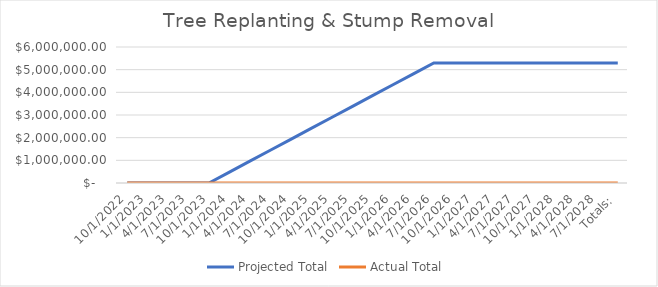
| Category | Projected Total | Actual Total  |
|---|---|---|
| 10/1/2022 | 0 | 0 |
| 1/1/2023 | 0 | 0 |
| 4/1/2023 | 0 | 0 |
| 7/1/2023 | 0 | 0 |
| 10/1/2023 | 0 | 0 |
| 1/1/2024 | 481497 | 0 |
| 4/1/2024 | 962994 | 0 |
| 7/1/2024 | 1444491 | 0 |
| 10/1/2024 | 1925988 | 0 |
| 1/1/2025 | 2407485 | 0 |
| 4/1/2025 | 2888982 | 0 |
| 7/1/2025 | 3370479 | 0 |
| 10/1/2025 | 3851976 | 0 |
| 1/1/2026 | 4333473 | 0 |
| 4/1/2026 | 4814970 | 0 |
| 7/1/2026 | 5296467 | 0 |
| 10/1/2026 | 5296467 | 0 |
| 1/1/2027 | 5296467 | 0 |
| 4/1/2027 | 5296467 | 0 |
| 7/1/2027 | 5296467 | 0 |
| 10/1/2027 | 5296467 | 0 |
| 1/1/2028 | 5296467 | 0 |
| 4/1/2028 | 5296467 | 0 |
| 7/1/2028 | 5296467 | 0 |
| Totals: | 5296467 | 0 |